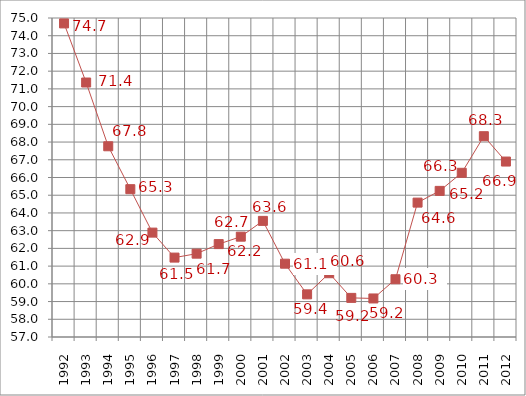
| Category | Series 0 | Series 1 |
|---|---|---|
| 1992.0 | 1992 | 74.694 |
| 1993.0 | 1993 | 71.359 |
| 1994.0 | 1994 | 67.762 |
| 1995.0 | 1995 | 65.341 |
| 1996.0 | 1996 | 62.89 |
| 1997.0 | 1997 | 61.48 |
| 1998.0 | 1998 | 61.703 |
| 1999.0 | 1999 | 62.242 |
| 2000.0 | 2000 | 62.661 |
| 2001.0 | 2001 | 63.552 |
| 2002.0 | 2002 | 61.136 |
| 2003.0 | 2003 | 59.406 |
| 2004.0 | 2004 | 60.599 |
| 2005.0 | 2005 | 59.207 |
| 2006.0 | 2006 | 59.175 |
| 2007.0 | 2007 | 60.259 |
| 2008.0 | 2008 | 64.582 |
| 2009.0 | 2009 | 65.245 |
| 2010.0 | 2010 | 66.265 |
| 2011.0 | 2011 | 68.331 |
| 2012.0 | 2012 | 66.9 |